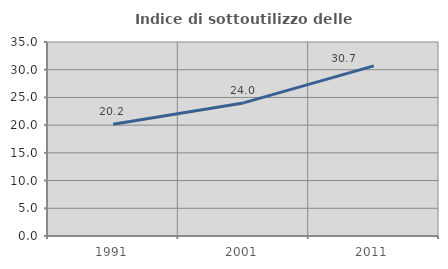
| Category | Indice di sottoutilizzo delle abitazioni  |
|---|---|
| 1991.0 | 20.153 |
| 2001.0 | 24.009 |
| 2011.0 | 30.7 |